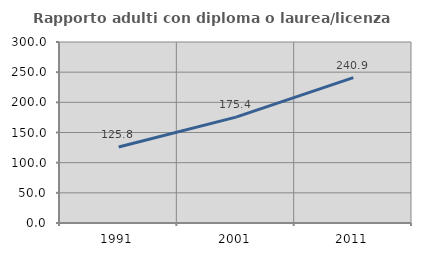
| Category | Rapporto adulti con diploma o laurea/licenza media  |
|---|---|
| 1991.0 | 125.849 |
| 2001.0 | 175.423 |
| 2011.0 | 240.892 |